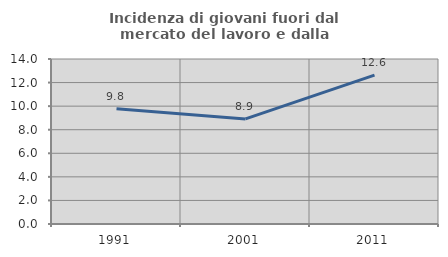
| Category | Incidenza di giovani fuori dal mercato del lavoro e dalla formazione  |
|---|---|
| 1991.0 | 9.785 |
| 2001.0 | 8.914 |
| 2011.0 | 12.634 |